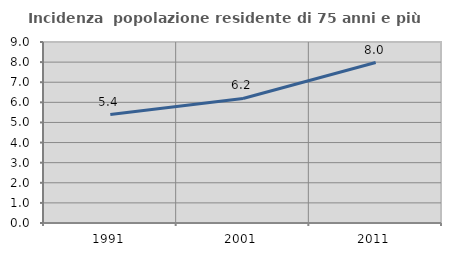
| Category | Incidenza  popolazione residente di 75 anni e più |
|---|---|
| 1991.0 | 5.394 |
| 2001.0 | 6.192 |
| 2011.0 | 7.979 |